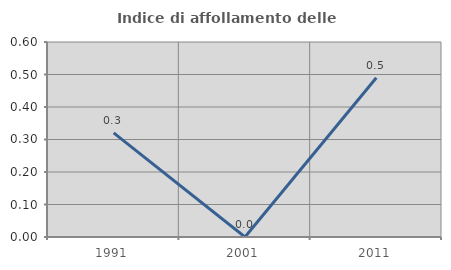
| Category | Indice di affollamento delle abitazioni  |
|---|---|
| 1991.0 | 0.321 |
| 2001.0 | 0 |
| 2011.0 | 0.49 |